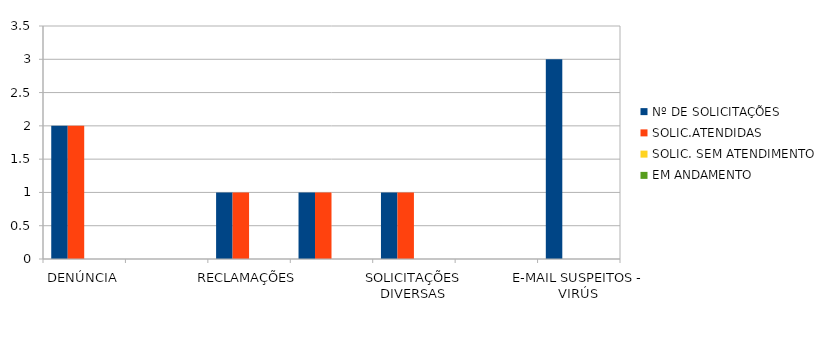
| Category | Nº DE SOLICITAÇÕES | SOLIC.ATENDIDAS | SOLIC. SEM ATENDIMENTO | EM ANDAMENTO |
|---|---|---|---|---|
| DENÚNCIA | 2 | 2 | 0 | 0 |
| DÚVIDA | 0 | 0 | 0 | 0 |
| RECLAMAÇÕES | 1 | 1 | 0 | 0 |
| PEDIDO DE ACESSO À INFORMAÇÃO | 1 | 1 | 0 | 0 |
| SOLICITAÇÕES DIVERSAS | 1 | 1 | 0 | 0 |
| SUGESTÃO  | 0 | 0 | 0 | 0 |
| E-MAIL SUSPEITOS - VIRÚS | 3 | 0 | 0 | 0 |